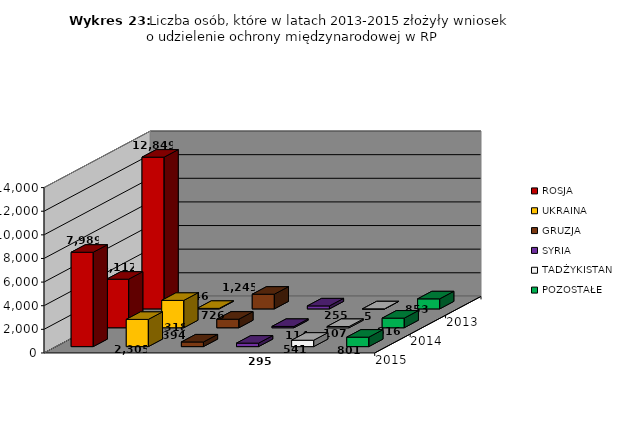
| Category | ROSJA | UKRAINA | GRUZJA | SYRIA | TADŻYKISTAN | POZOSTAŁE |
|---|---|---|---|---|---|---|
| 2013.0 | 12849 | 46 | 1245 | 255 | 5 | 853 |
| 2014.0 | 4112 | 2318 | 726 | 114 | 107 | 816 |
| 2015.0 | 7989 | 2305 | 394 | 295 | 541 | 801 |